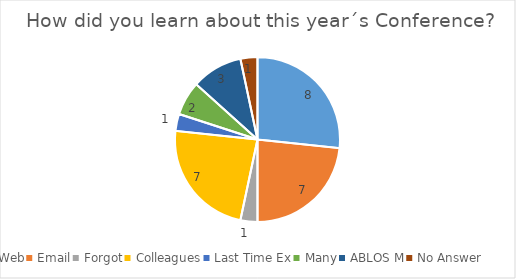
| Category | Series 0 |
|---|---|
| Web | 8 |
| Email | 7 |
| Forgot | 1 |
| Colleagues | 7 |
| Last Time Ex | 1 |
| Many | 2 |
| ABLOS M | 3 |
| No Answer | 1 |